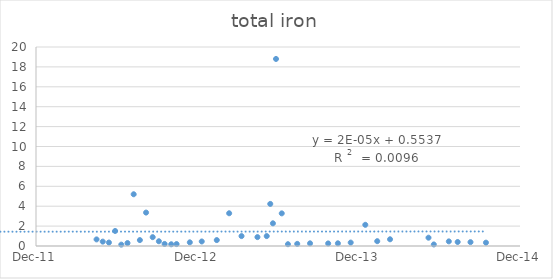
| Category | Series 0 |
|---|---|
| 41017.0 | 0.663 |
| 41031.0 | 0.441 |
| 41045.0 | 0.348 |
| 41059.0 | 1.51 |
| 41073.0 | 0.137 |
| 41087.0 | 0.296 |
| 41101.0 | 5.2 |
| 41115.0 | 0.594 |
| 41129.0 | 3.36 |
| 41144.0 | 0.89 |
| 41158.0 | 0.476 |
| 41171.0 | 0.207 |
| 41186.0 | 0.173 |
| 41198.0 | 0.194 |
| 41228.0 | 0.368 |
| 41255.0 | 0.455 |
| 41289.0 | 0.594 |
| 41317.0 | 3.29 |
| 41345.0 | 0.996 |
| 41381.0 | 0.894 |
| 41402.0 | 0.996 |
| 41410.0 | 4.23 |
| 41416.0 | 2.28 |
| 41423.0 | 18.8 |
| 41436.0 | 3.28 |
| 41450.0 | 0.18 |
| 41471.0 | 0.214 |
| 41500.0 | 0.269 |
| 41541.0 | 0.258 |
| 41563.0 | 0.27 |
| 41592.0 | 0.343 |
| 41625.0 | 2.13 |
| 41652.0 | 0.484 |
| 41681.0 | 0.675 |
| 41768.0 | 0.834 |
| 41780.0 | 0.155 |
| 41814.0 | 0.464 |
| 41834.0 | 0.403 |
| 41863.0 | 0.387 |
| 41898.0 | 0.336 |